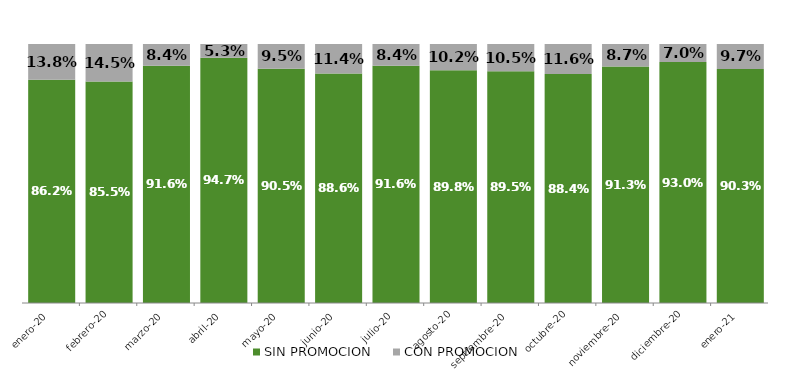
| Category | SIN PROMOCION   | CON PROMOCION   |
|---|---|---|
| 2020-01-01 | 0.862 | 0.138 |
| 2020-02-01 | 0.855 | 0.145 |
| 2020-03-01 | 0.916 | 0.084 |
| 2020-04-01 | 0.947 | 0.053 |
| 2020-05-01 | 0.905 | 0.095 |
| 2020-06-01 | 0.886 | 0.114 |
| 2020-07-01 | 0.916 | 0.084 |
| 2020-08-01 | 0.898 | 0.102 |
| 2020-09-01 | 0.895 | 0.105 |
| 2020-10-01 | 0.884 | 0.116 |
| 2020-11-01 | 0.913 | 0.087 |
| 2020-12-01 | 0.93 | 0.07 |
| 2021-01-01 | 0.903 | 0.097 |